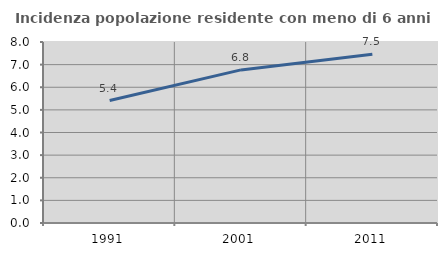
| Category | Incidenza popolazione residente con meno di 6 anni |
|---|---|
| 1991.0 | 5.413 |
| 2001.0 | 6.766 |
| 2011.0 | 7.457 |